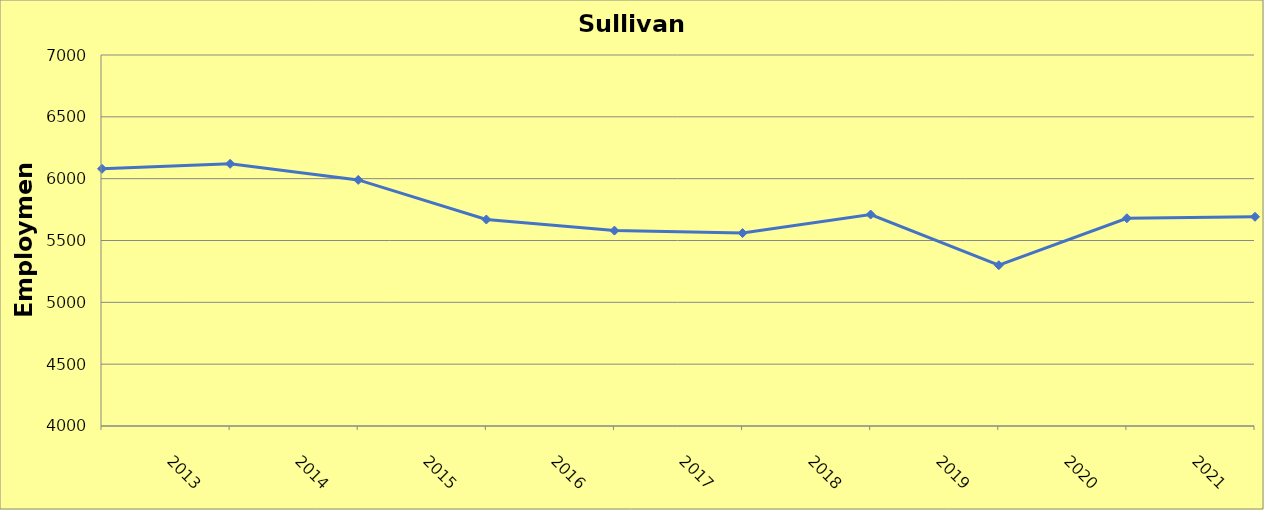
| Category | Sullivan County |
|---|---|
| 2013.0 | 6080 |
| 2014.0 | 6120 |
| 2015.0 | 5990 |
| 2016.0 | 5670 |
| 2017.0 | 5580 |
| 2018.0 | 5560 |
| 2019.0 | 5710 |
| 2020.0 | 5300 |
| 2021.0 | 5680 |
| 2022.0 | 5692 |